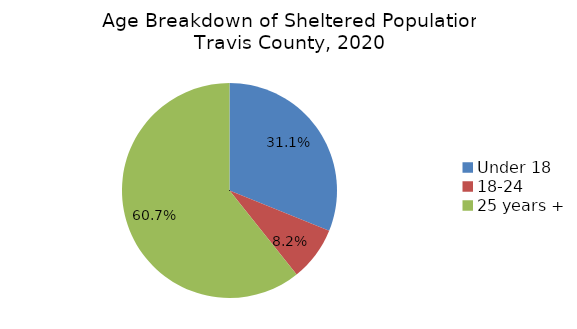
| Category | Percent of Total Sheltered |
|---|---|
| Under 18 | 0.311 |
| 18-24 | 0.082 |
| 25 years + | 0.607 |